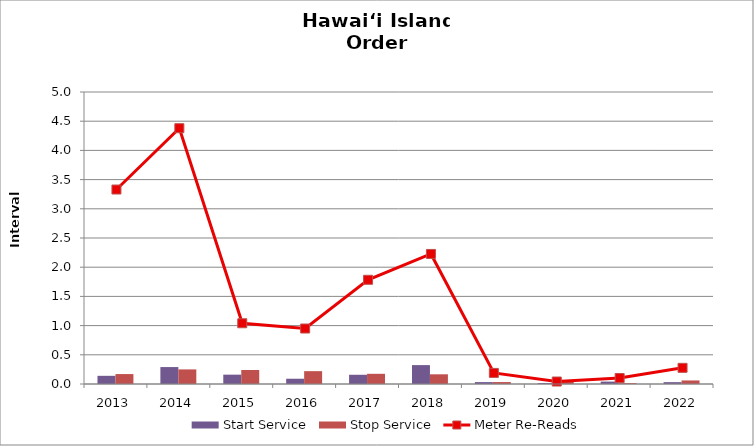
| Category | Start Service | Stop Service |
|---|---|---|
| 2013.0 | 0.14 | 0.17 |
| 2014.0 | 0.29 | 0.25 |
| 2015.0 | 0.16 | 0.24 |
| 2016.0 | 0.09 | 0.22 |
| 2017.0 | 0.158 | 0.175 |
| 2018.0 | 0.324 | 0.166 |
| 2019.0 | 0.033 | 0.033 |
| 2020.0 | 0.015 | 0.043 |
| 2021.0 | 0.041 | 0.015 |
| 2022.0 | 0.032 | 0.061 |